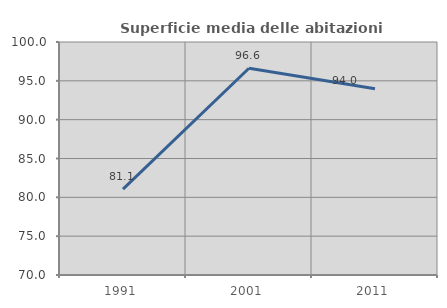
| Category | Superficie media delle abitazioni occupate |
|---|---|
| 1991.0 | 81.064 |
| 2001.0 | 96.62 |
| 2011.0 | 93.994 |